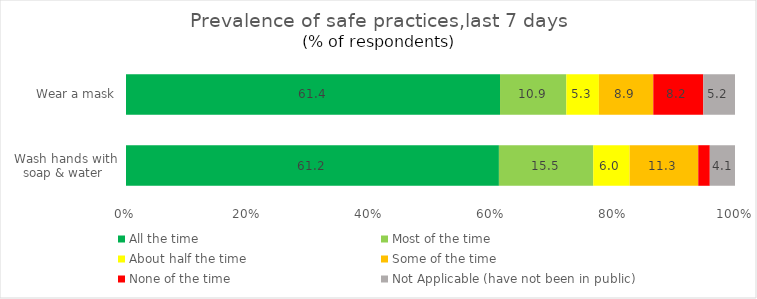
| Category | All the time | Most of the time | About half the time | Some of the time | None of the time | Not Applicable (have not been in public) |
|---|---|---|---|---|---|---|
| Wash hands with soap & water  | 61.233 | 15.491 | 5.967 | 11.277 | 1.893 | 4.139 |
| Wear a mask | 61.414 | 10.893 | 5.345 | 8.933 | 8.216 | 5.201 |